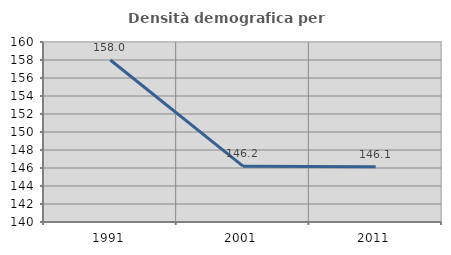
| Category | Densità demografica |
|---|---|
| 1991.0 | 158.004 |
| 2001.0 | 146.205 |
| 2011.0 | 146.15 |